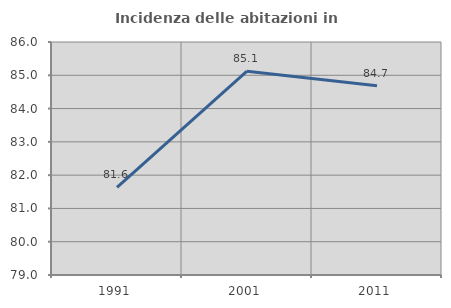
| Category | Incidenza delle abitazioni in proprietà  |
|---|---|
| 1991.0 | 81.636 |
| 2001.0 | 85.123 |
| 2011.0 | 84.684 |